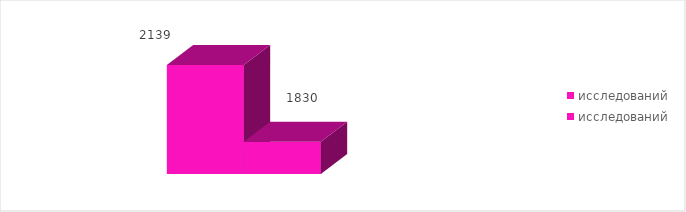
| Category | исследований |
|---|---|
| 0 | 1830 |